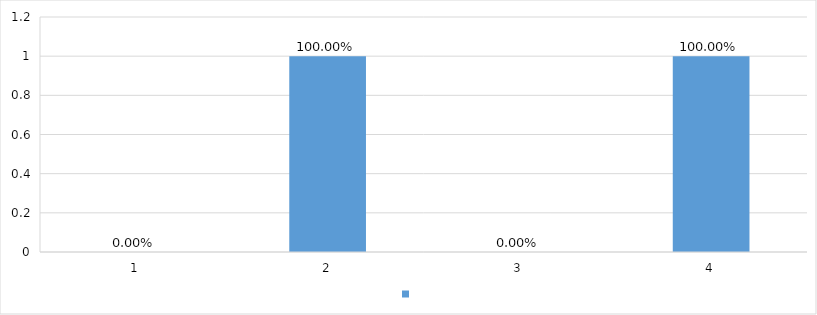
| Category | Series 0 |
|---|---|
| 1 | 0 |
| 2 | 1 |
| 3 | 0 |
| 4 | 1 |